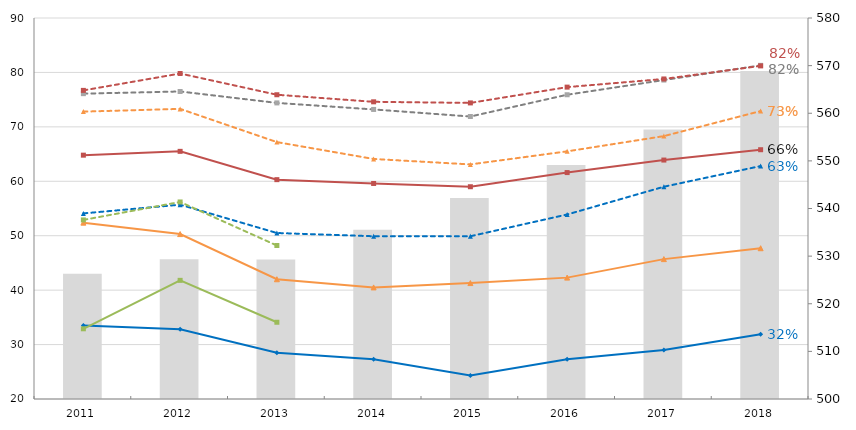
| Category | PIB 1er trimestre |
|---|---|
| 2011.0 | 526.286 |
| 2012.0 | 529.356 |
| 2013.0 | 529.29 |
| 2014.0 | 535.512 |
| 2015.0 | 542.195 |
| 2016.0 | 549.134 |
| 2017.0 | 556.591 |
| 2018.0 | 568.865 |